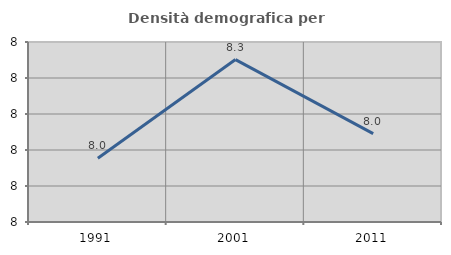
| Category | Densità demografica |
|---|---|
| 1991.0 | 7.977 |
| 2001.0 | 8.251 |
| 2011.0 | 8.046 |